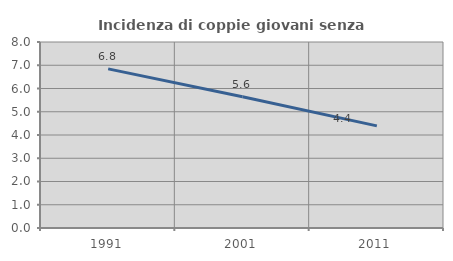
| Category | Incidenza di coppie giovani senza figli |
|---|---|
| 1991.0 | 6.845 |
| 2001.0 | 5.642 |
| 2011.0 | 4.393 |